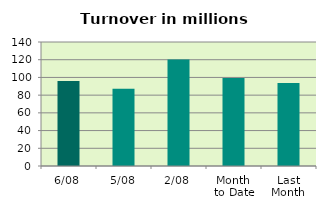
| Category | Series 0 |
|---|---|
| 6/08 | 95.865 |
| 5/08 | 87.342 |
| 2/08 | 120.179 |
| Month 
to Date | 99.227 |
| Last
Month | 93.691 |